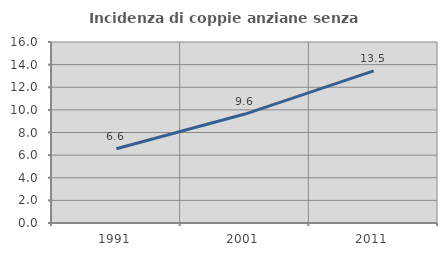
| Category | Incidenza di coppie anziane senza figli  |
|---|---|
| 1991.0 | 6.562 |
| 2001.0 | 9.629 |
| 2011.0 | 13.452 |